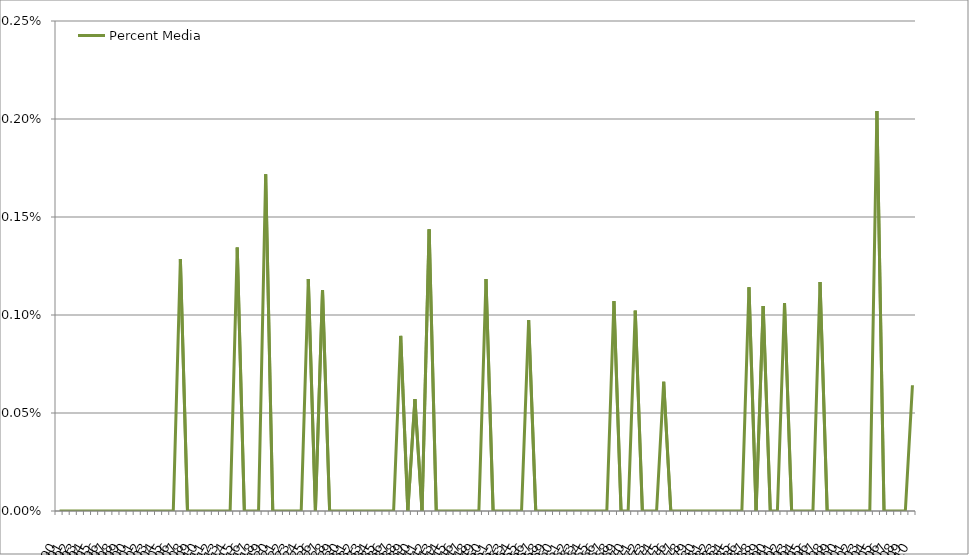
| Category | Percent Media |
|---|---|
| 1890.0 | 0 |
| 1891.0 | 0 |
| 1892.0 | 0 |
| 1893.0 | 0 |
| 1894.0 | 0 |
| 1895.0 | 0 |
| 1896.0 | 0 |
| 1897.0 | 0 |
| 1898.0 | 0 |
| 1899.0 | 0 |
| 1900.0 | 0 |
| 1901.0 | 0 |
| 1902.0 | 0 |
| 1903.0 | 0 |
| 1904.0 | 0 |
| 1905.0 | 0 |
| 1906.0 | 0 |
| 1907.0 | 0.001 |
| 1908.0 | 0 |
| 1909.0 | 0 |
| 1910.0 | 0 |
| 1911.0 | 0 |
| 1912.0 | 0 |
| 1913.0 | 0 |
| 1914.0 | 0 |
| 1915.0 | 0.001 |
| 1916.0 | 0 |
| 1917.0 | 0 |
| 1918.0 | 0 |
| 1919.0 | 0.002 |
| 1920.0 | 0 |
| 1921.0 | 0 |
| 1922.0 | 0 |
| 1923.0 | 0 |
| 1924.0 | 0 |
| 1925.0 | 0.001 |
| 1926.0 | 0 |
| 1927.0 | 0.001 |
| 1928.0 | 0 |
| 1929.0 | 0 |
| 1930.0 | 0 |
| 1931.0 | 0 |
| 1932.0 | 0 |
| 1933.0 | 0 |
| 1934.0 | 0 |
| 1935.0 | 0 |
| 1936.0 | 0 |
| 1937.0 | 0 |
| 1938.0 | 0.001 |
| 1939.0 | 0 |
| 1940.0 | 0.001 |
| 1941.0 | 0 |
| 1942.0 | 0.001 |
| 1943.0 | 0 |
| 1944.0 | 0 |
| 1945.0 | 0 |
| 1946.0 | 0 |
| 1947.0 | 0 |
| 1948.0 | 0 |
| 1949.0 | 0 |
| 1950.0 | 0.001 |
| 1951.0 | 0 |
| 1952.0 | 0 |
| 1953.0 | 0 |
| 1954.0 | 0 |
| 1955.0 | 0 |
| 1956.0 | 0.001 |
| 1957.0 | 0 |
| 1958.0 | 0 |
| 1959.0 | 0 |
| 1960.0 | 0 |
| 1961.0 | 0 |
| 1962.0 | 0 |
| 1963.0 | 0 |
| 1964.0 | 0 |
| 1965.0 | 0 |
| 1966.0 | 0 |
| 1967.0 | 0 |
| 1968.0 | 0.001 |
| 1969.0 | 0 |
| 1970.0 | 0 |
| 1971.0 | 0.001 |
| 1972.0 | 0 |
| 1973.0 | 0 |
| 1974.0 | 0 |
| 1975.0 | 0.001 |
| 1976.0 | 0 |
| 1977.0 | 0 |
| 1978.0 | 0 |
| 1979.0 | 0 |
| 1980.0 | 0 |
| 1981.0 | 0 |
| 1982.0 | 0 |
| 1983.0 | 0 |
| 1984.0 | 0 |
| 1985.0 | 0 |
| 1986.0 | 0 |
| 1987.0 | 0.001 |
| 1988.0 | 0 |
| 1989.0 | 0.001 |
| 1990.0 | 0 |
| 1991.0 | 0 |
| 1992.0 | 0.001 |
| 1993.0 | 0 |
| 1994.0 | 0 |
| 1995.0 | 0 |
| 1996.0 | 0 |
| 1997.0 | 0.001 |
| 1998.0 | 0 |
| 1999.0 | 0 |
| 2000.0 | 0 |
| 2001.0 | 0 |
| 2002.0 | 0 |
| 2003.0 | 0 |
| 2004.0 | 0 |
| 2005.0 | 0.002 |
| 2006.0 | 0 |
| 2007.0 | 0 |
| 2008.0 | 0 |
| 2009.0 | 0 |
| 2010.0 | 0.001 |